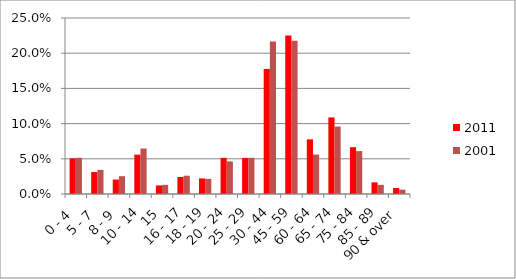
| Category | 2011 | 2001 |
|---|---|---|
|  0 - 4 | 5.064 | 5.144 |
|  5 - 7 | 3.121 | 3.417 |
|  8 - 9 | 2.051 | 2.528 |
|  10 - 14 | 5.593 | 6.46 |
| 15 | 1.215 | 1.3 |
|  16 - 17 | 2.415 | 2.601 |
| 18 - 19 | 2.212 | 2.15 |
|  20 - 24 | 5.134 | 4.629 |
|  25 - 29 | 5.122 | 5.135 |
|  30 - 44 | 17.769 | 21.659 |
|  45 - 59 | 22.509 | 21.773 |
|  60 - 64 | 7.763 | 5.611 |
| 65 - 74 | 10.874 | 9.581 |
| 75 - 84 | 6.651 | 6.095 |
|  85 - 89 | 1.656 | 1.293 |
|  90 & over | 0.85 | 0.622 |